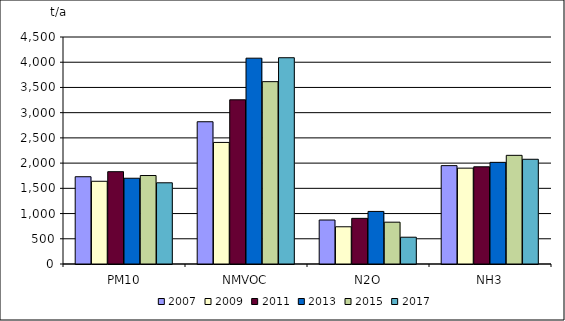
| Category | 2007 | 2009 | 2011 | 2013 | 2015 | 2017 |
|---|---|---|---|---|---|---|
| PM10 | 1730 | 1640 | 1830 | 1700 | 1754 | 1610 |
| NMVOC | 2820 | 2410 | 3255 | 4080 | 3615 | 4089 |
| N2O | 872 | 738 | 905 | 1042 | 829 | 531 |
| NH3 | 1950 | 1900 | 1927 | 2015 | 2154 | 2076 |